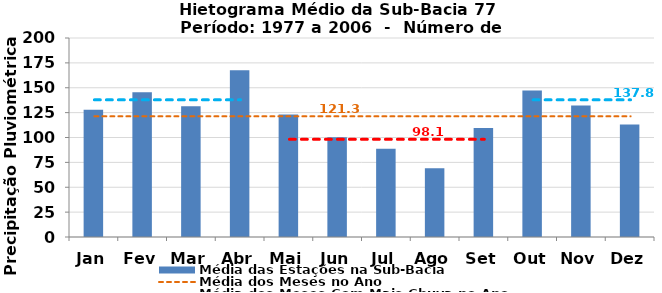
| Category | Média das Estações na Sub-Bacia |
|---|---|
| Jan | 127.863 |
| Fev | 145.531 |
| Mar | 131.311 |
| Abr | 167.632 |
| Mai | 123.037 |
| Jun | 100.141 |
| Jul | 88.818 |
| Ago | 69.203 |
| Set | 109.453 |
| Out | 147.161 |
| Nov | 132.263 |
| Dez | 112.951 |